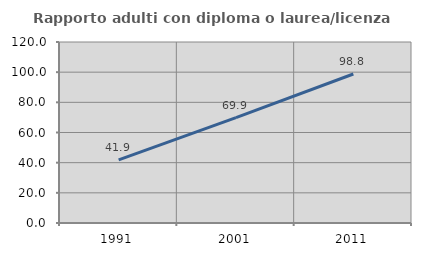
| Category | Rapporto adulti con diploma o laurea/licenza media  |
|---|---|
| 1991.0 | 41.866 |
| 2001.0 | 69.87 |
| 2011.0 | 98.788 |